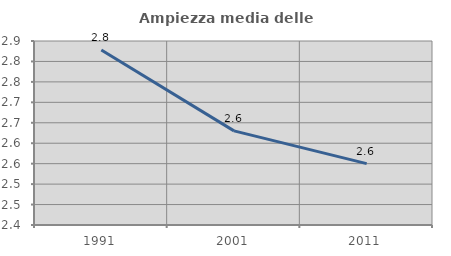
| Category | Ampiezza media delle famiglie |
|---|---|
| 1991.0 | 2.828 |
| 2001.0 | 2.63 |
| 2011.0 | 2.55 |